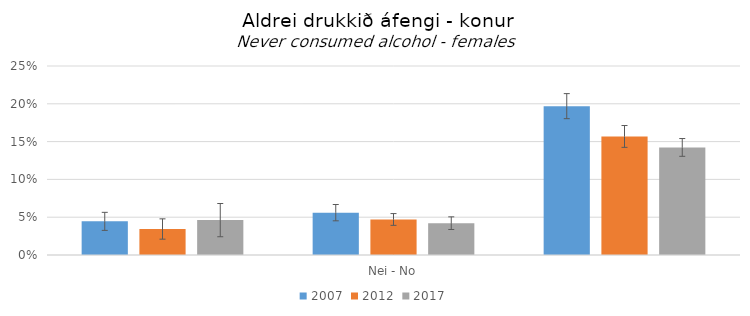
| Category | 2007 | 2012 | 2017 |
|---|---|---|---|
| 0 | 0.044 | 0.034 | 0.046 |
| 1 | 0.056 | 0.047 | 0.042 |
| 2 | 0.197 | 0.157 | 0.142 |